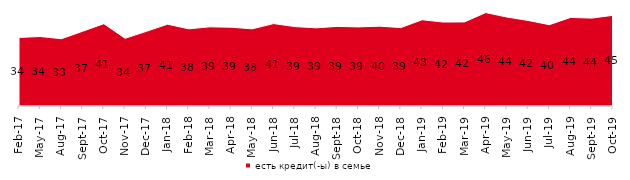
| Category | есть кредит(-ы) в семье |
|---|---|
| 2017-02-01 | 33.95 |
| 2017-05-01 | 34.4 |
| 2017-08-01 | 33.3 |
| 2017-09-01 | 37 |
| 2017-10-01 | 40.75 |
| 2017-11-01 | 33.5 |
| 2017-12-01 | 36.95 |
| 2018-01-01 | 40.5 |
| 2018-02-01 | 38.2 |
| 2018-03-01 | 39.2 |
| 2018-04-01 | 39 |
| 2018-05-01 | 38.2 |
| 2018-06-01 | 40.8 |
| 2018-07-01 | 39.3 |
| 2018-08-01 | 38.7 |
| 2018-09-01 | 39.4 |
| 2018-10-01 | 39.15 |
| 2018-11-01 | 39.521 |
| 2018-12-01 | 38.8 |
| 2019-01-01 | 42.7 |
| 2019-02-01 | 41.55 |
| 2019-03-01 | 41.621 |
| 2019-04-01 | 46.238 |
| 2019-05-01 | 44.032 |
| 2019-06-01 | 42.344 |
| 2019-07-01 | 40.248 |
| 2019-08-01 | 43.856 |
| 2019-09-01 | 43.515 |
| 2019-10-01 | 44.901 |